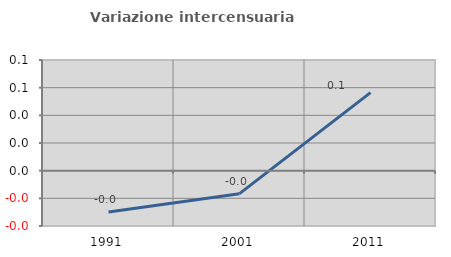
| Category | Variazione intercensuaria annua |
|---|---|
| 1991.0 | -0.03 |
| 2001.0 | -0.017 |
| 2011.0 | 0.056 |